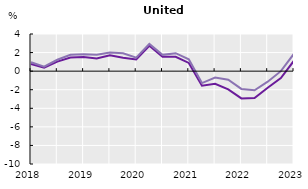
| Category | Basic wage (all sectors) | Basic wage (private sector) | Wage incl. Lump sums and special payments (all sectors) | Wage incl. Lump sums and special payments (private sector) |
|---|---|---|---|---|
| 2018.0 | 0.769 |  | 0.964 |  |
| nan | 0.378 |  | 0.475 |  |
| nan | 1.032 |  | 1.227 |  |
| nan | 1.465 |  | 1.758 |  |
| 2019.0 | 1.53 |  | 1.825 |  |
| nan | 1.364 |  | 1.757 |  |
| nan | 1.712 |  | 2.007 |  |
| nan | 1.438 |  | 1.928 |  |
| 2020.0 | 1.255 |  | 1.451 |  |
| nan | 2.726 |  | 2.925 |  |
| nan | 1.559 |  | 1.756 |  |
| nan | 1.541 |  | 1.936 |  |
| 2021.0 | 0.885 |  | 1.277 |  |
| nan | -1.573 |  | -1.287 |  |
| nan | -1.363 |  | -0.698 |  |
| nan | -1.958 |  | -0.927 |  |
| 2022.0 | -2.933 |  | -1.914 |  |
| nan | -2.886 |  | -2.058 |  |
| nan | -1.781 |  | -1.135 |  |
| nan | -0.749 |  | -0.002 |  |
| 2023.0 | 1.13 |  | 1.886 |  |